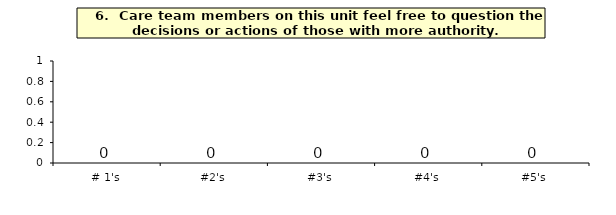
| Category | Q_6 |
|---|---|
| # 1's | 0 |
| #2's | 0 |
| #3's | 0 |
| #4's | 0 |
| #5's | 0 |